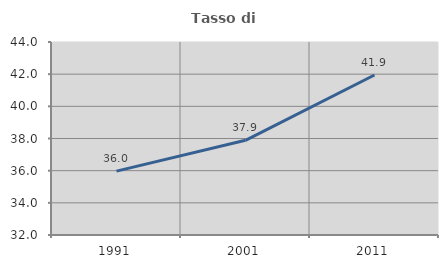
| Category | Tasso di occupazione   |
|---|---|
| 1991.0 | 35.974 |
| 2001.0 | 37.889 |
| 2011.0 | 41.949 |